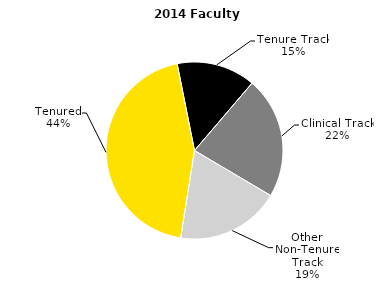
| Category | Series 0 |
|---|---|
| Tenured | 1127.934 |
| Tenure Track | 366.109 |
| Clinical Track | 565.742 |
| Other Non-Tenure Track | 483.175 |